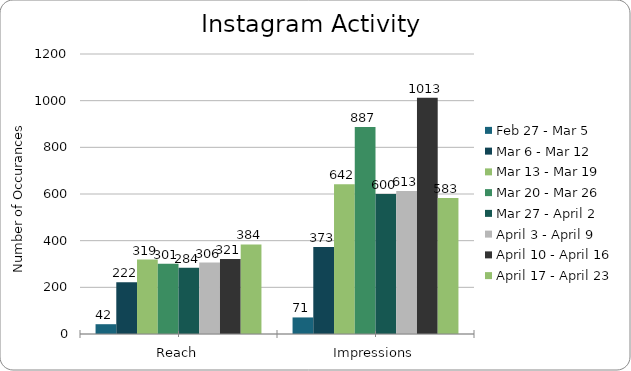
| Category | Feb 27 - Mar 5 | Mar 6 - Mar 12 | Mar 13 - Mar 19 | Mar 20 - Mar 26 | Mar 27 - April 2 | April 3 - April 9 | April 10 - April 16 | April 17 - April 23 |
|---|---|---|---|---|---|---|---|---|
| Reach | 42 | 222 | 319 | 301 | 284 | 306 | 321 | 384 |
| Impressions | 71 | 373 | 642 | 887 | 600 | 613 | 1013 | 583 |